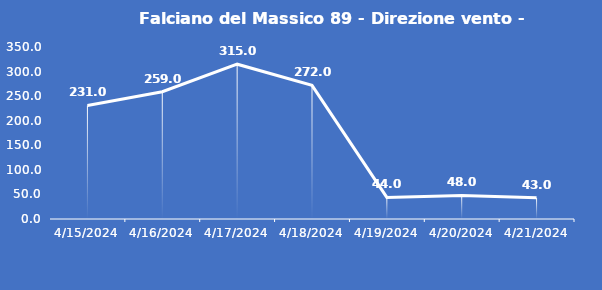
| Category | Falciano del Massico 89 - Direzione vento - Grezzo (°N) |
|---|---|
| 4/15/24 | 231 |
| 4/16/24 | 259 |
| 4/17/24 | 315 |
| 4/18/24 | 272 |
| 4/19/24 | 44 |
| 4/20/24 | 48 |
| 4/21/24 | 43 |